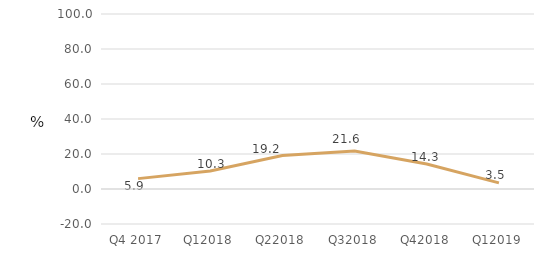
| Category | Series 0 |
|---|---|
| Q4 2017 | 5.93 |
| Q12018 | 10.288 |
| Q22018 | 19.193 |
| Q32018 | 21.642 |
| Q42018 | 14.323 |
| Q12019 | 3.522 |